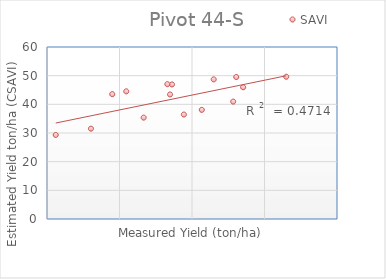
| Category | SAVI |
|---|---|
| 42.240001 | 46.937 |
| 41.599998 | 47.034 |
| 34.0 | 43.545 |
| 41.972999 | 43.445 |
| 26.202999 | 29.315 |
| 31.062999 | 31.508 |
| 52.049999 | 45.952 |
| 35.932998 | 44.531 |
| 51.099998 | 49.523 |
| 50.682998 | 40.951 |
| 46.349998 | 38.067 |
| 58.0 | 49.619 |
| 43.876998 | 36.439 |
| 38.333 | 35.363 |
| 47.993 | 48.703 |